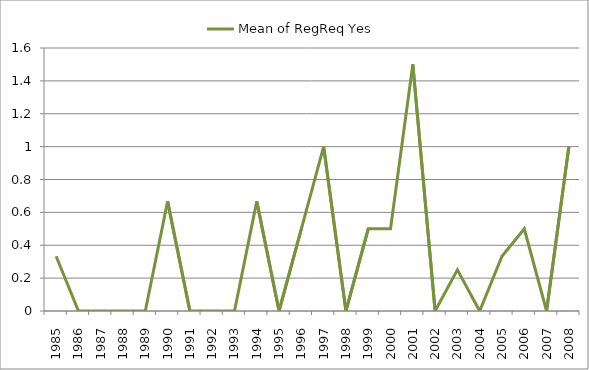
| Category | Mean of RegReq Yes |
|---|---|
| 1985.0 | 0.333 |
| 1986.0 | 0 |
| 1987.0 | 0 |
| 1988.0 | 0 |
| 1989.0 | 0 |
| 1990.0 | 0.667 |
| 1991.0 | 0 |
| 1992.0 | 0 |
| 1993.0 | 0 |
| 1994.0 | 0.667 |
| 1995.0 | 0 |
| 1996.0 | 0.5 |
| 1997.0 | 1 |
| 1998.0 | 0 |
| 1999.0 | 0.5 |
| 2000.0 | 0.5 |
| 2001.0 | 1.5 |
| 2002.0 | 0 |
| 2003.0 | 0.25 |
| 2004.0 | 0 |
| 2005.0 | 0.333 |
| 2006.0 | 0.5 |
| 2007.0 | 0 |
| 2008.0 | 1 |